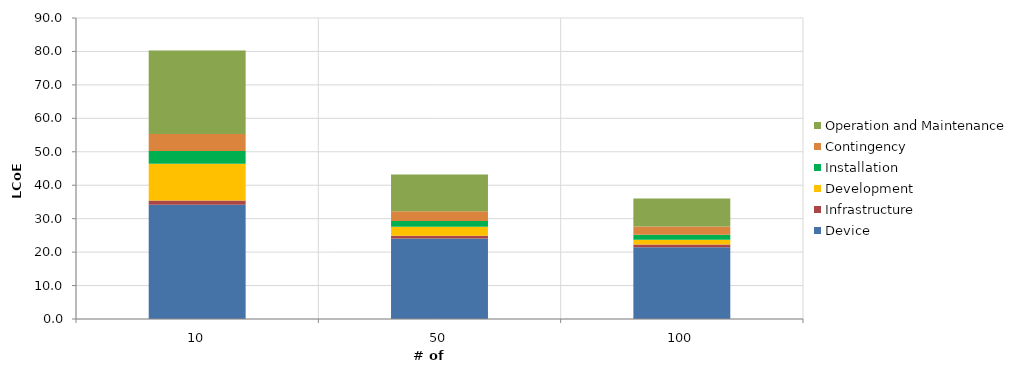
| Category | Device | Infrastructure | Development | Installation | Contingency | Operation and Maintenance |
|---|---|---|---|---|---|---|
| 10.0 | 34.192 | 1.205 | 11.007 | 3.862 | 5.027 | 24.984 |
| 50.0 | 24.09 | 0.796 | 2.681 | 1.713 | 2.928 | 11.012 |
| 100.0 | 21.486 | 0.77 | 1.425 | 1.483 | 2.516 | 8.321 |